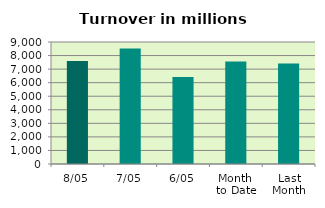
| Category | Series 0 |
|---|---|
| 8/05 | 7591.429 |
| 7/05 | 8517.36 |
| 6/05 | 6414.426 |
| Month 
to Date | 7555.155 |
| Last
Month | 7412.755 |